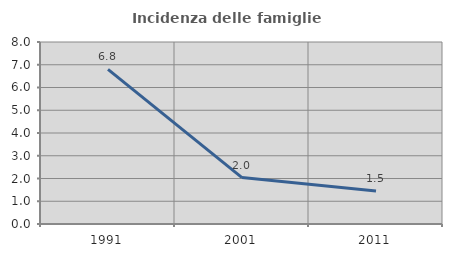
| Category | Incidenza delle famiglie numerose |
|---|---|
| 1991.0 | 6.796 |
| 2001.0 | 2.041 |
| 2011.0 | 1.455 |